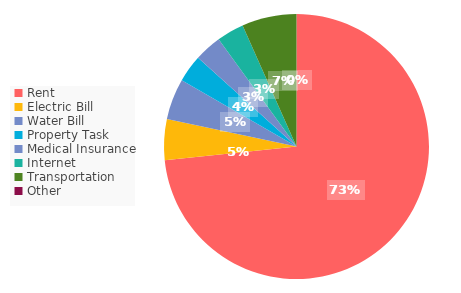
| Category | Series 0 |
|---|---|
| Rent | 2200 |
| Electric Bill | 150 |
| Water Bill | 150 |
| Property Task | 100 |
| Medical Insurance | 100 |
| Internet | 100 |
| Transportation | 200 |
| Other | 0 |